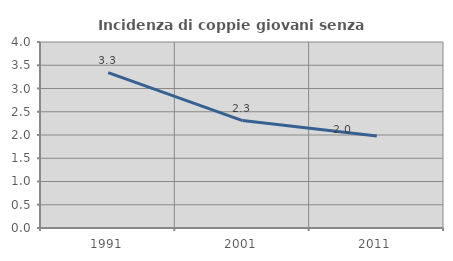
| Category | Incidenza di coppie giovani senza figli |
|---|---|
| 1991.0 | 3.342 |
| 2001.0 | 2.31 |
| 2011.0 | 1.977 |